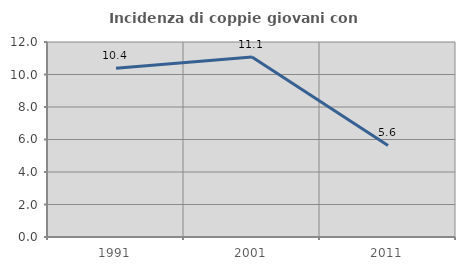
| Category | Incidenza di coppie giovani con figli |
|---|---|
| 1991.0 | 10.39 |
| 2001.0 | 11.082 |
| 2011.0 | 5.634 |